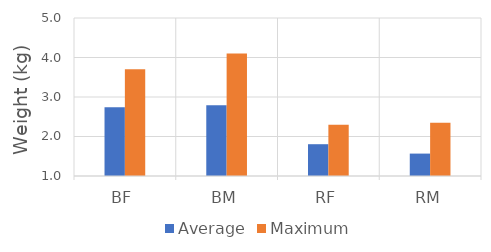
| Category | Average | Maximum |
|---|---|---|
| BF | 2.738 | 3.7 |
| BM | 2.794 | 4.1 |
| RF | 1.805 | 2.3 |
| RM | 1.567 | 2.35 |